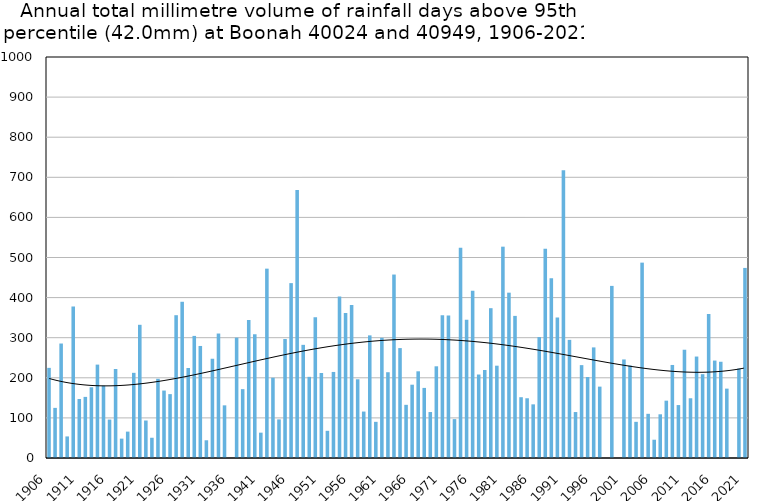
| Category | Annual total mm in days above 95th percentile |
|---|---|
| 1906 | 224.8 |
| 1907 | 125 |
| 1908 | 285.5 |
| 1909 | 53.8 |
| 1910 | 377.7 |
| 1911 | 147.1 |
| 1912 | 152.4 |
| 1913 | 176.4 |
| 1914 | 232.9 |
| 1915 | 180.3 |
| 1916 | 95.8 |
| 1917 | 222 |
| 1918 | 48.3 |
| 1919 | 65.8 |
| 1920 | 212.4 |
| 1921 | 332.2 |
| 1922 | 93.5 |
| 1923 | 50.5 |
| 1924 | 197.5 |
| 1925 | 168.2 |
| 1926 | 159.3 |
| 1927 | 356.1 |
| 1928 | 389.6 |
| 1929 | 224.4 |
| 1930 | 304.5 |
| 1931 | 279.4 |
| 1932 | 44.2 |
| 1933 | 247.5 |
| 1934 | 310.4 |
| 1935 | 131.3 |
| 1936 | 0 |
| 1937 | 300.2 |
| 1938 | 171.7 |
| 1939 | 344.4 |
| 1940 | 308.6 |
| 1941 | 63.2 |
| 1942 | 472.2 |
| 1943 | 200.2 |
| 1944 | 96.3 |
| 1945 | 296.7 |
| 1946 | 436.1 |
| 1947 | 668.3 |
| 1948 | 282.2 |
| 1949 | 202.4 |
| 1950 | 351 |
| 1951 | 212 |
| 1952 | 67.8 |
| 1953 | 214.6 |
| 1954 | 402.8 |
| 1955 | 361.5 |
| 1956 | 381.5 |
| 1957 | 196.3 |
| 1958 | 115.8 |
| 1959 | 305.8 |
| 1960 | 90.2 |
| 1961 | 299.8 |
| 1962 | 213.9 |
| 1963 | 457.5 |
| 1964 | 274.1 |
| 1965 | 132.6 |
| 1966 | 182.8 |
| 1967 | 216.2 |
| 1968 | 174.8 |
| 1969 | 114.6 |
| 1970 | 228.7 |
| 1971 | 355.9 |
| 1972 | 355.4 |
| 1973 | 97 |
| 1974 | 524.2 |
| 1975 | 345 |
| 1976 | 417 |
| 1977 | 208.2 |
| 1978 | 219.4 |
| 1979 | 373.6 |
| 1980 | 230.2 |
| 1981 | 527 |
| 1982 | 412.3 |
| 1983 | 354.4 |
| 1984 | 151.6 |
| 1985 | 149 |
| 1986 | 133.8 |
| 1987 | 301.6 |
| 1988 | 522 |
| 1989 | 448.2 |
| 1990 | 350.4 |
| 1991 | 717.4 |
| 1992 | 294.6 |
| 1993 | 114.6 |
| 1994 | 231.6 |
| 1995 | 202 |
| 1996 | 275.8 |
| 1997 | 178 |
| 1998 | 0 |
| 1999 | 429.2 |
| 2000 | 0 |
| 2001 | 245.8 |
| 2002 | 230.8 |
| 2003 | 90.2 |
| 2004 | 487.2 |
| 2005 | 110.2 |
| 2006 | 45.6 |
| 2007 | 109 |
| 2008 | 143 |
| 2009 | 232 |
| 2010 | 132 |
| 2011 | 270 |
| 2012 | 149 |
| 2013 | 253 |
| 2014 | 209 |
| 2015 | 359 |
| 2016 | 243 |
| 2017 | 240 |
| 2018 | 173 |
| 2019 | 0 |
| 2020 | 223 |
| 2021 | 474 |